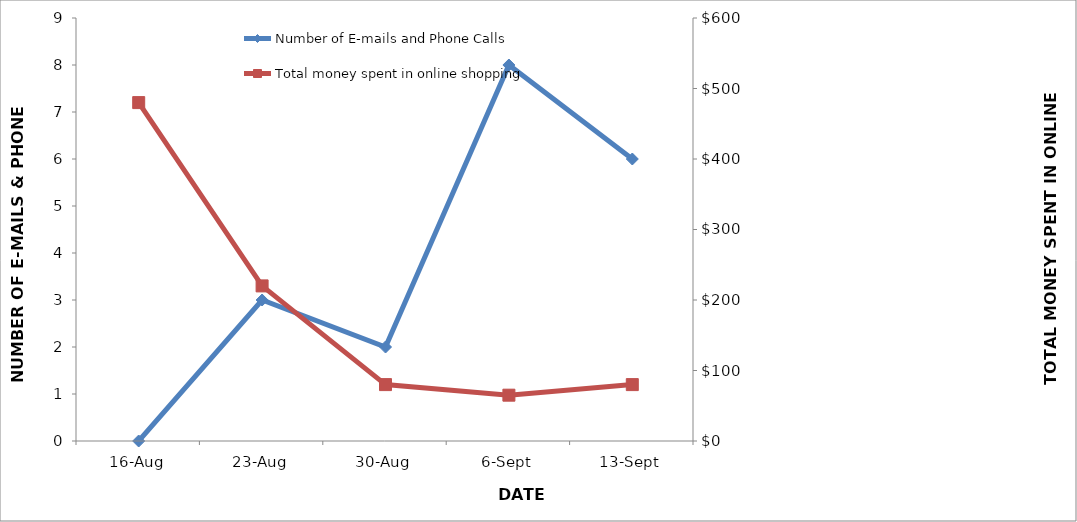
| Category | Number of E-mails and Phone Calls |
|---|---|
| 2014-08-16 | 0 |
| 2014-08-23 | 3 |
| 2014-08-30 | 2 |
| 2014-09-06 | 8 |
| 2014-09-13 | 6 |